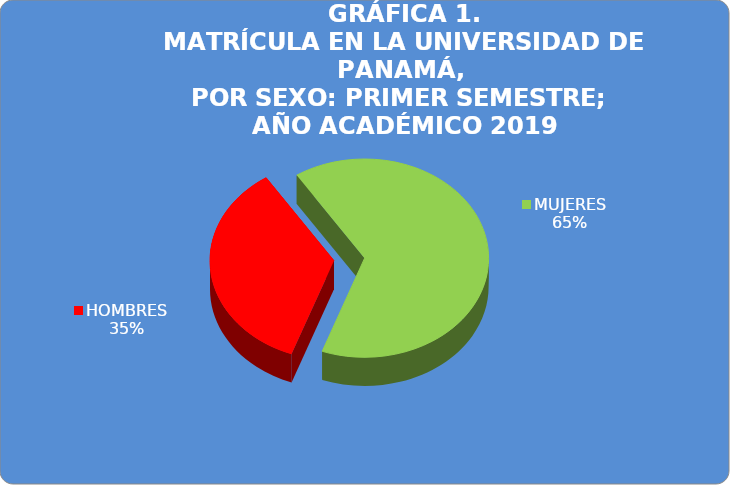
| Category | Series 0 |
|---|---|
| HOMBRES | 25267 |
| MUJERES | 46467 |